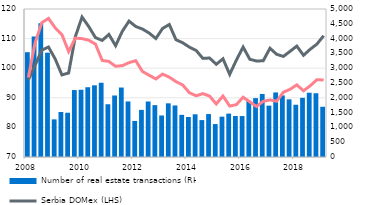
| Category | Number of real estate transactions (RHS) |
|---|---|
| 2008 | 3540 |
| II | 4071 |
| III | 4515 |
| IV | 3524 |
| 2009 | 1271 |
| II | 1521 |
| III | 1495 |
| IV | 2262 |
| 2010 | 2272 |
| II | 2357 |
| III | 2422 |
| IV | 2508 |
| 2011 | 1782 |
| II | 2078 |
| III | 2347 |
| IV | 1877 |
| 2012 | 1218 |
| II | 1592 |
| III | 1875 |
| IV | 1752 |
| 2013 | 1403 |
| II | 1813 |
| III | 1741 |
| IV | 1424 |
| 2014 | 1351 |
| II | 1443 |
| III | 1247 |
| IV | 1451 |
| 2015 | 1113 |
| II | 1363 |
| III | 1466 |
| IV | 1385 |
| 2016 | 1384 |
| II | 1897 |
| III | 1989 |
| IV | 2128 |
| 2017 | 1735 |
| II | 2181 |
| III | 2081 |
| IV | 1948 |
| 2018 | 1765 |
| II | 1999 |
| III | 2171 |
| IV | 2154 |
| 2019 | 1697 |